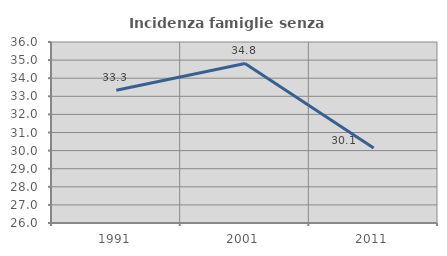
| Category | Incidenza famiglie senza nuclei |
|---|---|
| 1991.0 | 33.333 |
| 2001.0 | 34.815 |
| 2011.0 | 30.147 |